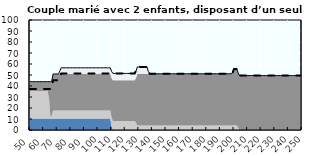
| Category | Coin fiscal marginal (somme des composantes) | Taux d’imposition marginal net |
|---|---|---|
| 50.0 | 43.962 | 37.376 |
| 51.0 | 43.962 | 37.376 |
| 52.0 | 43.962 | 37.376 |
| 53.0 | 43.962 | 37.376 |
| 54.0 | 43.962 | 37.376 |
| 55.0 | 43.962 | 37.376 |
| 56.0 | 43.962 | 37.376 |
| 57.0 | 43.962 | 37.376 |
| 58.0 | 43.962 | 37.376 |
| 59.0 | 43.962 | 37.376 |
| 60.0 | 43.962 | 37.376 |
| 61.0 | 43.962 | 37.376 |
| 62.0 | 43.962 | 37.376 |
| 63.0 | 43.962 | 37.376 |
| 64.0 | 43.962 | 37.376 |
| 65.0 | 43.962 | 37.376 |
| 66.0 | 44.474 | 37.947 |
| 67.0 | 50.962 | 45.198 |
| 68.0 | 50.962 | 45.198 |
| 69.0 | 50.962 | 45.198 |
| 70.0 | 50.962 | 45.198 |
| 71.0 | 50.962 | 45.198 |
| 72.0 | 53.891 | 48.472 |
| 73.0 | 56.541 | 51.433 |
| 74.0 | 56.541 | 51.433 |
| 75.0 | 56.541 | 51.433 |
| 76.0 | 56.541 | 51.433 |
| 77.0 | 56.541 | 51.433 |
| 78.0 | 56.541 | 51.433 |
| 79.0 | 56.541 | 51.433 |
| 80.0 | 56.541 | 51.433 |
| 81.0 | 56.541 | 51.433 |
| 82.0 | 56.541 | 51.433 |
| 83.0 | 56.541 | 51.433 |
| 84.0 | 56.541 | 51.433 |
| 85.0 | 56.541 | 51.433 |
| 86.0 | 56.541 | 51.433 |
| 87.0 | 56.541 | 51.433 |
| 88.0 | 56.541 | 51.433 |
| 89.0 | 56.541 | 51.433 |
| 90.0 | 56.541 | 51.433 |
| 91.0 | 56.541 | 51.433 |
| 92.0 | 56.541 | 51.433 |
| 93.0 | 56.541 | 51.433 |
| 94.0 | 56.541 | 51.433 |
| 95.0 | 56.541 | 51.433 |
| 96.0 | 56.541 | 51.433 |
| 97.0 | 56.541 | 51.433 |
| 98.0 | 56.541 | 51.433 |
| 99.0 | 56.541 | 51.433 |
| 100.0 | 56.541 | 51.433 |
| 101.0 | 56.541 | 51.433 |
| 102.0 | 56.541 | 51.433 |
| 103.0 | 56.541 | 51.433 |
| 104.0 | 56.541 | 51.433 |
| 105.0 | 56.541 | 51.433 |
| 106.0 | 56.541 | 51.433 |
| 107.0 | 56.541 | 51.433 |
| 108.0 | 56.541 | 51.433 |
| 109.0 | 56.541 | 51.433 |
| 110.0 | 53.264 | 51.433 |
| 111.0 | 51.433 | 51.433 |
| 112.0 | 51.433 | 51.433 |
| 113.0 | 51.433 | 51.433 |
| 114.0 | 51.433 | 51.433 |
| 115.0 | 51.433 | 51.433 |
| 116.0 | 51.433 | 51.433 |
| 117.0 | 51.433 | 51.433 |
| 118.0 | 51.433 | 51.433 |
| 119.0 | 51.433 | 51.433 |
| 120.0 | 51.433 | 51.433 |
| 121.0 | 51.433 | 51.433 |
| 122.0 | 51.433 | 51.433 |
| 123.0 | 51.433 | 51.433 |
| 124.0 | 51.433 | 51.433 |
| 125.0 | 51.433 | 51.433 |
| 126.0 | 51.433 | 51.433 |
| 127.0 | 51.433 | 51.433 |
| 128.0 | 53.928 | 53.928 |
| 129.0 | 57.365 | 57.365 |
| 130.0 | 57.365 | 57.365 |
| 131.0 | 57.365 | 57.365 |
| 132.0 | 57.365 | 57.365 |
| 133.0 | 57.365 | 57.365 |
| 134.0 | 57.365 | 57.365 |
| 135.0 | 57.365 | 57.365 |
| 136.0 | 57.365 | 57.365 |
| 137.0 | 53.293 | 53.293 |
| 138.0 | 51.13 | 51.13 |
| 139.0 | 51.13 | 51.13 |
| 140.0 | 51.13 | 51.13 |
| 141.0 | 51.13 | 51.13 |
| 142.0 | 51.13 | 51.13 |
| 143.0 | 51.13 | 51.13 |
| 144.0 | 51.13 | 51.13 |
| 145.0 | 51.13 | 51.13 |
| 146.0 | 51.13 | 51.13 |
| 147.0 | 51.13 | 51.13 |
| 148.0 | 51.13 | 51.13 |
| 149.0 | 51.13 | 51.13 |
| 150.0 | 51.13 | 51.13 |
| 151.0 | 51.13 | 51.13 |
| 152.0 | 51.13 | 51.13 |
| 153.0 | 51.13 | 51.13 |
| 154.0 | 51.13 | 51.13 |
| 155.0 | 51.13 | 51.13 |
| 156.0 | 51.13 | 51.13 |
| 157.0 | 51.13 | 51.13 |
| 158.0 | 51.13 | 51.13 |
| 159.0 | 51.13 | 51.13 |
| 160.0 | 51.13 | 51.13 |
| 161.0 | 51.13 | 51.13 |
| 162.0 | 51.13 | 51.13 |
| 163.0 | 51.13 | 51.13 |
| 164.0 | 51.13 | 51.13 |
| 165.0 | 51.13 | 51.13 |
| 166.0 | 51.13 | 51.13 |
| 167.0 | 51.13 | 51.13 |
| 168.0 | 51.13 | 51.13 |
| 169.0 | 51.13 | 51.13 |
| 170.0 | 51.13 | 51.13 |
| 171.0 | 51.13 | 51.13 |
| 172.0 | 51.13 | 51.13 |
| 173.0 | 51.13 | 51.13 |
| 174.0 | 51.13 | 51.13 |
| 175.0 | 51.13 | 51.13 |
| 176.0 | 51.13 | 51.13 |
| 177.0 | 51.13 | 51.13 |
| 178.0 | 51.13 | 51.13 |
| 179.0 | 51.13 | 51.13 |
| 180.0 | 51.13 | 51.13 |
| 181.0 | 51.13 | 51.13 |
| 182.0 | 51.13 | 51.13 |
| 183.0 | 51.13 | 51.13 |
| 184.0 | 51.13 | 51.13 |
| 185.0 | 51.13 | 51.13 |
| 186.0 | 51.13 | 51.13 |
| 187.0 | 51.13 | 51.13 |
| 188.0 | 51.13 | 51.13 |
| 189.0 | 51.13 | 51.13 |
| 190.0 | 51.13 | 51.13 |
| 191.0 | 51.13 | 51.13 |
| 192.0 | 51.13 | 51.13 |
| 193.0 | 51.13 | 51.13 |
| 194.0 | 51.13 | 51.13 |
| 195.0 | 51.13 | 51.13 |
| 196.0 | 51.13 | 51.13 |
| 197.0 | 51.13 | 51.13 |
| 198.0 | 51.13 | 51.13 |
| 199.0 | 52.305 | 52.305 |
| 200.0 | 55.36 | 55.36 |
| 201.0 | 55.36 | 55.36 |
| 202.0 | 55.36 | 55.36 |
| 203.0 | 52.269 | 52.269 |
| 204.0 | 49.5 | 49.5 |
| 205.0 | 49.5 | 49.5 |
| 206.0 | 49.5 | 49.5 |
| 207.0 | 49.5 | 49.5 |
| 208.0 | 49.5 | 49.5 |
| 209.0 | 49.5 | 49.5 |
| 210.0 | 49.5 | 49.5 |
| 211.0 | 49.5 | 49.5 |
| 212.0 | 49.5 | 49.5 |
| 213.0 | 49.5 | 49.5 |
| 214.0 | 49.5 | 49.5 |
| 215.0 | 49.5 | 49.5 |
| 216.0 | 49.5 | 49.5 |
| 217.0 | 49.5 | 49.5 |
| 218.0 | 49.5 | 49.5 |
| 219.0 | 49.5 | 49.5 |
| 220.0 | 49.5 | 49.5 |
| 221.0 | 49.5 | 49.5 |
| 222.0 | 49.5 | 49.5 |
| 223.0 | 49.5 | 49.5 |
| 224.0 | 49.5 | 49.5 |
| 225.0 | 49.5 | 49.5 |
| 226.0 | 49.5 | 49.5 |
| 227.0 | 49.5 | 49.5 |
| 228.0 | 49.5 | 49.5 |
| 229.0 | 49.5 | 49.5 |
| 230.0 | 49.5 | 49.5 |
| 231.0 | 49.5 | 49.5 |
| 232.0 | 49.5 | 49.5 |
| 233.0 | 49.5 | 49.5 |
| 234.0 | 49.5 | 49.5 |
| 235.0 | 49.5 | 49.5 |
| 236.0 | 49.5 | 49.5 |
| 237.0 | 49.5 | 49.5 |
| 238.0 | 49.5 | 49.5 |
| 239.0 | 49.5 | 49.5 |
| 240.0 | 49.5 | 49.5 |
| 241.0 | 49.5 | 49.5 |
| 242.0 | 49.5 | 49.5 |
| 243.0 | 49.5 | 49.5 |
| 244.0 | 49.5 | 49.5 |
| 245.0 | 49.5 | 49.5 |
| 246.0 | 49.5 | 49.5 |
| 247.0 | 49.5 | 49.5 |
| 248.0 | 49.5 | 49.5 |
| 249.0 | 49.5 | 49.5 |
| 250.0 | 49.5 | 49.5 |